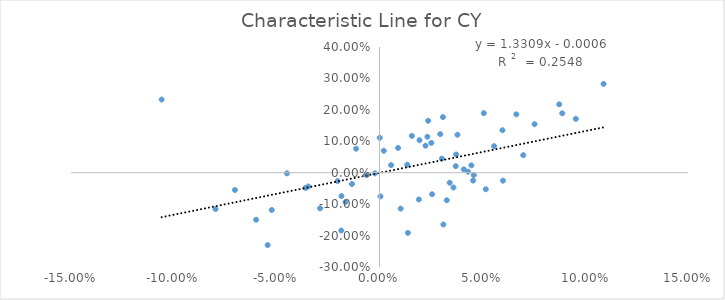
| Category | CY |
|---|---|
| -0.1059327 | 0.233 |
| 0.08737310000000001 | 0.218 |
| 0.095444 | 0.171 |
| 0.0557042 | 0.084 |
| 0.0020888 | 0.07 |
| 0.07540079999999999 | 0.154 |
| 0.035958000000000004 | -0.047 |
| 0.0370559 | 0.021 |
| -0.018584 | -0.184 |
| 0.0597727 | 0.135 |
| 0.0194468 | 0.103 |
| -0.035959500000000005 | -0.048 |
| 0.0308422 | 0.177 |
| 0.0600575 | -0.025 |
| 0.015744400000000002 | 0.117 |
| -0.07970780000000001 | -0.116 |
| -0.0523916 | -0.119 |
| 0.0698836 | 0.056 |
| -0.044996799999999997 | -0.002 |
| 0.0888592 | 0.189 |
| 0.0379096 | 0.121 |
| 0.0001036 | 0.111 |
| 0.0665253 | 0.186 |
| 0.0236714 | 0.165 |
| 0.0341335 | -0.032 |
| 0.0004617 | -0.075 |
| 0.029523 | 0.123 |
| -0.0113769 | 0.076 |
| -0.0165366 | -0.094 |
| -0.0203741 | -0.026 |
| -0.0543726 | -0.23 |
| -0.070295 | -0.055 |
| 0.108948 | 0.283 |
| -0.0022722000000000003 | -0.002 |
| 0.0102924 | -0.114 |
| 0.0446856 | 0.023 |
| 0.0430358 | 0.003 |
| 0.032705899999999996 | -0.088 |
| -0.006343499999999999 | -0.008 |
| -0.0599879 | -0.15 |
| 0.040982399999999995 | 0.011 |
| 0.0138008 | -0.191 |
| 0.0223781 | 0.086 |
| 0.0255778 | -0.068 |
| -0.018497200000000002 | -0.074 |
| 0.0056457 | 0.024 |
| 0.0090206 | 0.079 |
| 0.0516966 | -0.053 |
| 0.013493999999999999 | 0.025 |
| 0.0372938 | 0.058 |
| 0.0191384 | -0.085 |
| 0.0232838 | 0.114 |
| -0.0133928 | -0.036 |
| 0.0507292 | 0.19 |
| -0.028890600000000002 | -0.113 |
| 0.031069100000000002 | -0.165 |
| 0.0458378 | -0.007 |
| 0.030313500000000004 | 0.045 |
| 0.025194200000000003 | 0.095 |
| -0.0345952 | -0.044 |
| 0.045521200000000005 | -0.025 |